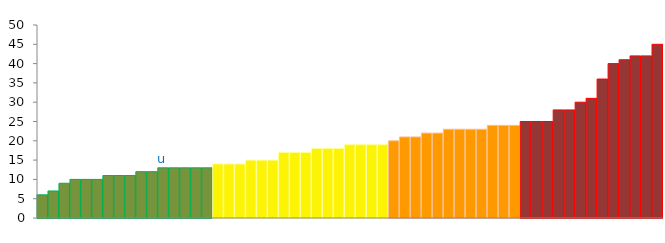
| Category | Top Quartile | 2nd Quartile | 3rd Quartile | Bottom Quartile | Series 4 |
|---|---|---|---|---|---|
|  | 6 | 0 | 0 | 0 | 6 |
|  | 7 | 0 | 0 | 0 | 7 |
|  | 9 | 0 | 0 | 0 | 9 |
|  | 10 | 0 | 0 | 0 | 10 |
|  | 10 | 0 | 0 | 0 | 10 |
|  | 10 | 0 | 0 | 0 | 10 |
|  | 11 | 0 | 0 | 0 | 11 |
|  | 11 | 0 | 0 | 0 | 11 |
|  | 11 | 0 | 0 | 0 | 11 |
|  | 12 | 0 | 0 | 0 | 12 |
|  | 12 | 0 | 0 | 0 | 12 |
| u | 13 | 0 | 0 | 0 | 13 |